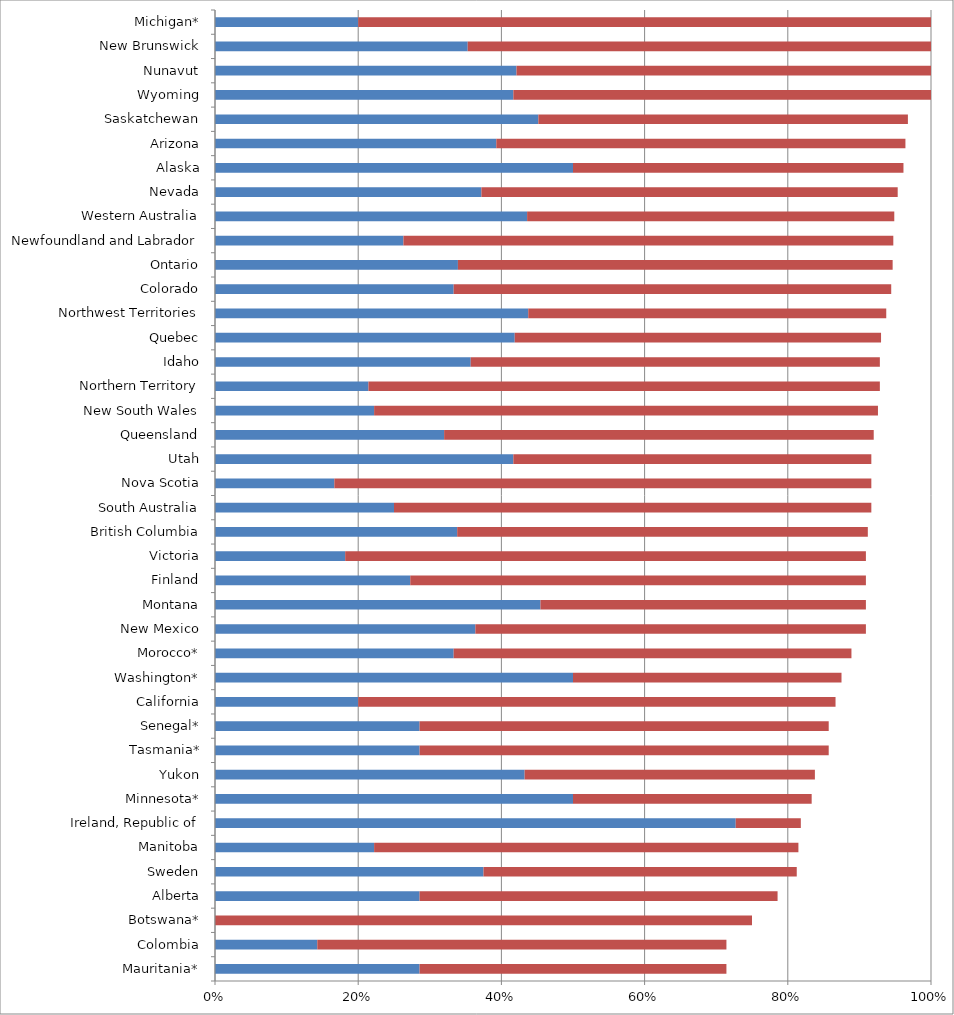
| Category | Series 0 | Series 1 |
|---|---|---|
| Mauritania* | 0.286 | 0.429 |
| Colombia | 0.143 | 0.571 |
| Botswana* | 0 | 0.75 |
| Alberta | 0.286 | 0.5 |
| Sweden | 0.375 | 0.438 |
| Manitoba | 0.222 | 0.593 |
| Ireland, Republic of | 0.727 | 0.091 |
| Minnesota* | 0.5 | 0.333 |
| Yukon | 0.432 | 0.405 |
| Tasmania* | 0.286 | 0.571 |
| Senegal* | 0.286 | 0.571 |
| California | 0.2 | 0.667 |
| Washington* | 0.5 | 0.375 |
| Morocco* | 0.333 | 0.556 |
| New Mexico | 0.364 | 0.545 |
| Montana | 0.455 | 0.455 |
| Finland | 0.273 | 0.636 |
| Victoria | 0.182 | 0.727 |
| British Columbia | 0.338 | 0.574 |
| South Australia | 0.25 | 0.667 |
| Nova Scotia | 0.167 | 0.75 |
| Utah | 0.417 | 0.5 |
| Queensland | 0.32 | 0.6 |
| New South Wales | 0.222 | 0.704 |
| Northern Territory | 0.214 | 0.714 |
| Idaho | 0.357 | 0.571 |
| Quebec | 0.419 | 0.512 |
| Northwest Territories | 0.438 | 0.5 |
| Colorado | 0.333 | 0.611 |
| Ontario | 0.339 | 0.607 |
| Newfoundland and Labrador | 0.263 | 0.684 |
| Western Australia | 0.436 | 0.513 |
| Nevada | 0.372 | 0.581 |
| Alaska | 0.5 | 0.462 |
| Arizona | 0.393 | 0.571 |
| Saskatchewan | 0.452 | 0.516 |
| Wyoming | 0.417 | 0.583 |
| Nunavut | 0.421 | 0.579 |
| New Brunswick | 0.353 | 0.647 |
| Michigan* | 0.2 | 0.8 |